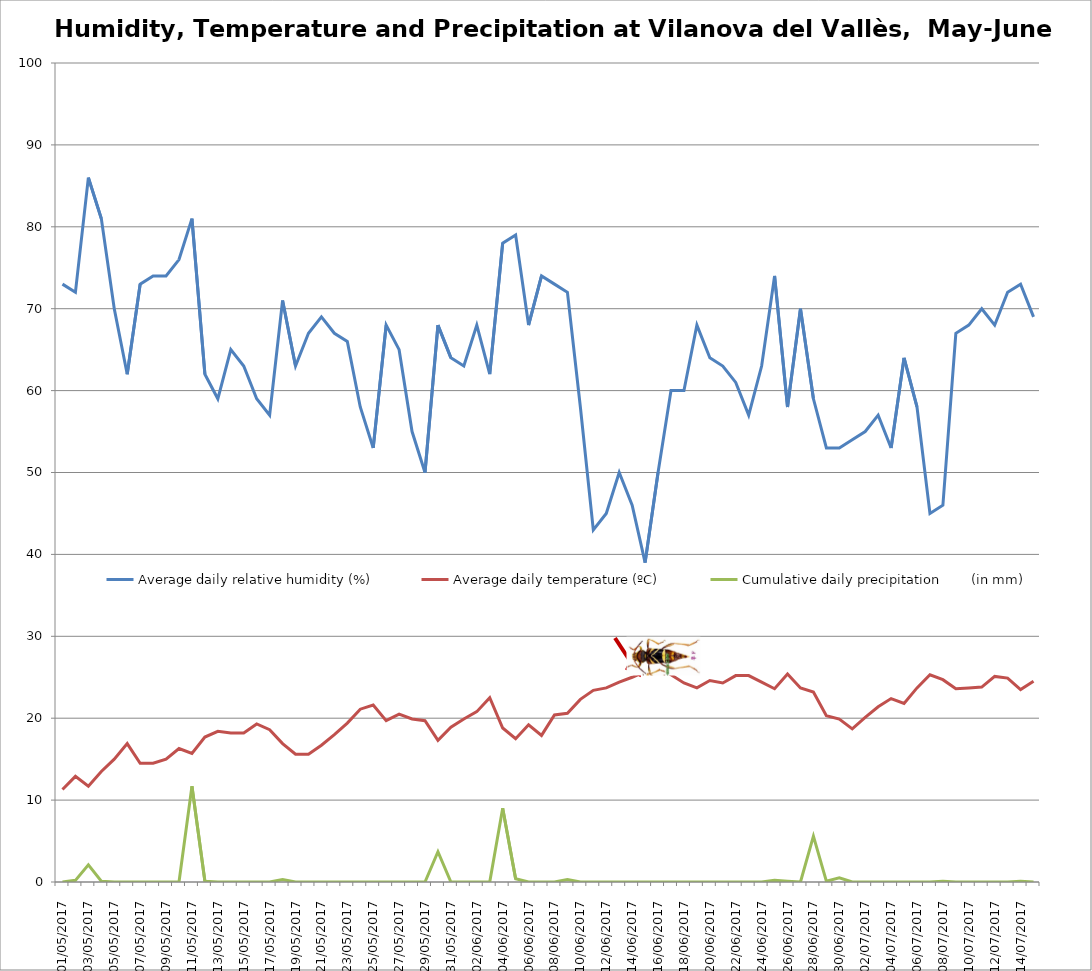
| Category | Average daily relative humidity (%) | Average daily temperature (ºC) | Cumulative daily precipitation        (in mm) |
|---|---|---|---|
| 01/05/2017 | 73 | 11.3 | 0 |
| 02/05/2017 | 72 | 12.9 | 0.2 |
| 03/05/2017 | 86 | 11.7 | 2.1 |
| 04/05/2017 | 81 | 13.5 | 0.1 |
| 05/05/2017 | 70 | 15 | 0 |
| 06/05/2017 | 62 | 16.9 | 0 |
| 07/05/2017 | 73 | 14.5 | 0 |
| 08/05/2017 | 74 | 14.5 | 0 |
| 09/05/2017 | 74 | 15 | 0 |
| 10/05/2017 | 76 | 16.3 | 0 |
| 11/05/2017 | 81 | 15.7 | 11.7 |
| 12/05/2017 | 62 | 17.7 | 0.1 |
| 13/05/2017 | 59 | 18.4 | 0 |
| 14/05/2017 | 65 | 18.2 | 0 |
| 15/05/2017 | 63 | 18.2 | 0 |
| 16/05/2017 | 59 | 19.3 | 0 |
| 17/05/2017 | 57 | 18.6 | 0 |
| 18/05/2017 | 71 | 16.9 | 0.3 |
| 19/05/2017 | 63 | 15.6 | 0 |
| 20/05/2017 | 67 | 15.6 | 0 |
| 21/05/2017 | 69 | 16.7 | 0 |
| 22/05/2017 | 67 | 18 | 0 |
| 23/05/2017 | 66 | 19.4 | 0 |
| 24/05/2017 | 58 | 21.1 | 0 |
| 25/05/2017 | 53 | 21.6 | 0 |
| 26/05/2017 | 68 | 19.7 | 0 |
| 27/05/2017 | 65 | 20.5 | 0 |
| 28/05/2017 | 55 | 19.9 | 0 |
| 29/05/2017 | 50 | 19.7 | 0 |
| 30/05/2017 | 68 | 17.3 | 3.7 |
| 31/05/2017 | 64 | 18.9 | 0 |
| 01/06/2017 | 63 | 19.9 | 0 |
| 02/06/2017 | 68 | 20.8 | 0 |
| 03/06/2017 | 62 | 22.5 | 0 |
| 04/06/2017 | 78 | 18.8 | 9 |
| 05/06/2017 | 79 | 17.5 | 0.4 |
| 06/06/2017 | 68 | 19.2 | 0 |
| 07/06/2017 | 74 | 17.9 | 0 |
| 08/06/2017 | 73 | 20.4 | 0 |
| 09/06/2017 | 72 | 20.6 | 0.3 |
| 10/06/2017 | 58 | 22.3 | 0 |
| 11/06/2017 | 43 | 23.4 | 0 |
| 12/06/2017 | 45 | 23.7 | 0 |
| 13/06/2017 | 50 | 24.4 | 0 |
| 14/06/2017 | 46 | 25 | 0 |
| 15/06/2017 | 39 | 25.7 | 0 |
| 16/06/2017 | 50 | 26.3 | 0 |
| 17/06/2017 | 60 | 25.3 | 0 |
| 18/06/2017 | 60 | 24.3 | 0 |
| 19/06/2017 | 68 | 23.7 | 0 |
| 20/06/2017 | 64 | 24.6 | 0 |
| 21/06/2017 | 63 | 24.3 | 0 |
| 22/06/2017 | 61 | 25.2 | 0 |
| 23/06/2017 | 57 | 25.2 | 0 |
| 24/06/2017 | 63 | 24.4 | 0 |
| 25/06/2017 | 74 | 23.6 | 0.2 |
| 26/06/2017 | 58 | 25.4 | 0.1 |
| 27/06/2017 | 70 | 23.7 | 0 |
| 28/06/2017 | 59 | 23.2 | 5.6 |
| 29/06/2017 | 53 | 20.3 | 0.1 |
| 30/06/2017 | 53 | 19.9 | 0.5 |
| 01/07/2017 | 54 | 18.7 | 0 |
| 02/07/2017 | 55 | 20.1 | 0 |
| 03/07/2017 | 57 | 21.4 | 0 |
| 04/07/2017 | 53 | 22.4 | 0 |
| 05/07/2017 | 64 | 21.8 | 0 |
| 06/07/2017 | 58 | 23.7 | 0 |
| 07/07/2017 | 45 | 25.3 | 0 |
| 08/07/2017 | 46 | 24.7 | 0.1 |
| 09/07/2017 | 67 | 23.6 | 0 |
| 10/07/2017 | 68 | 23.7 | 0 |
| 11/07/2017 | 70 | 23.8 | 0 |
| 12/07/2017 | 68 | 25.1 | 0 |
| 13/07/2017 | 72 | 24.9 | 0 |
| 14/07/2017 | 73 | 23.5 | 0.1 |
| 15/07/2017 | 69 | 24.5 | 0 |